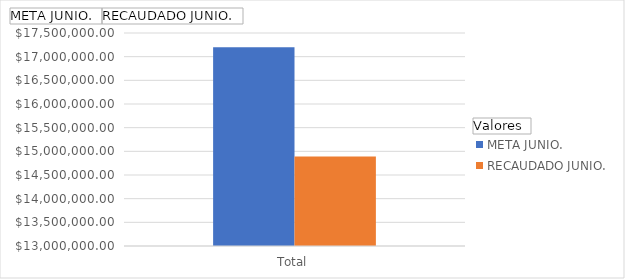
| Category | META JUNIO. | RECAUDADO JUNIO. |
|---|---|---|
| Total | 17199832 | 14892670.63 |